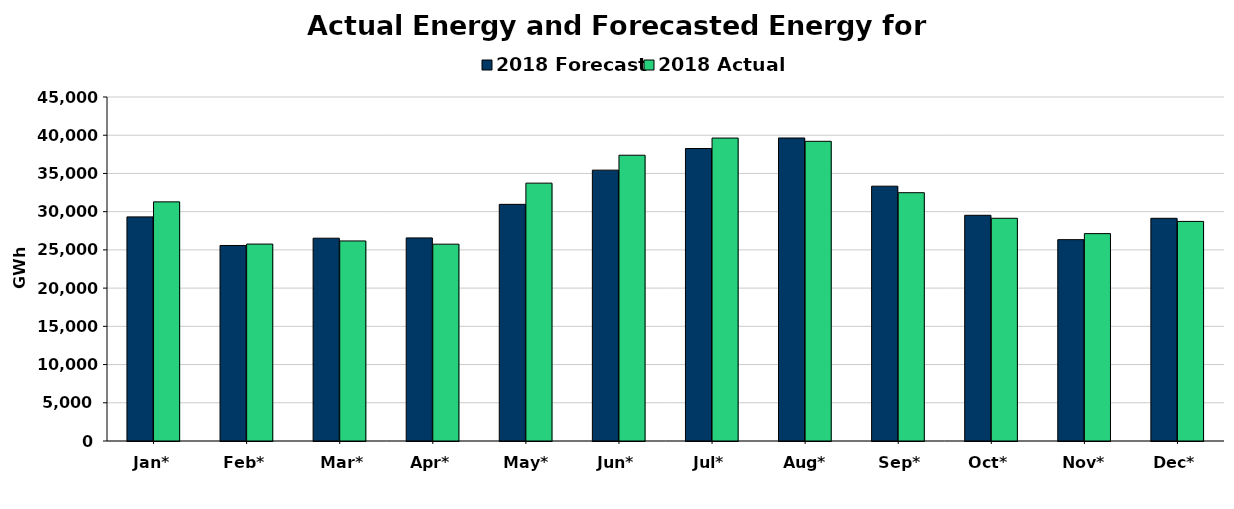
| Category | 2018 Forecast | 2018 Actual |
|---|---|---|
| Jan* | 29318 | 31282 |
| Feb* | 25577 | 25761 |
| Mar* | 26530 | 26170 |
| Apr* | 26567 | 25749 |
| May* | 30956 | 33733 |
| Jun* | 35434 | 37384 |
| Jul* | 38264 | 39629 |
| Aug* | 39640 | 39205 |
| Sep* | 33335 | 32481 |
| Oct* | 29526 | 29136 |
| Nov* | 26340 | 27128 |
| Dec* | 29132 | 28725 |